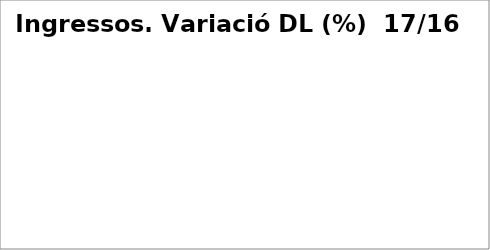
| Category | Series 0 |
|---|---|
| Impostos directes | 0.013 |
| Impostos indirectes | 0.082 |
| Taxes, preus públics i altres ingressos | -0.077 |
| Transferències corrents | 0.029 |
| Ingressos patrimonials | 0.047 |
| Venda d'inversions reals | 0.329 |
| Transferències de capital | -0.74 |
| Actius financers* | -0.501 |
| Passius financers | -0.194 |